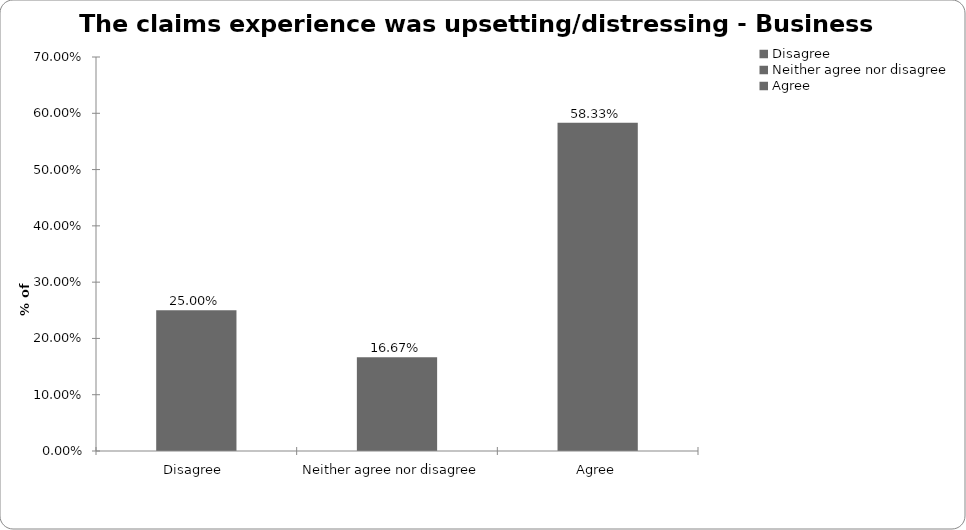
| Category | Business Interruption |
|---|---|
| Disagree  | 0.25 |
| Neither agree nor disagree  | 0.167 |
| Agree | 0.583 |